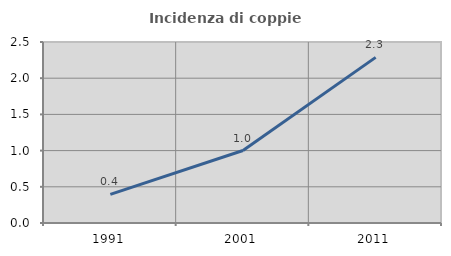
| Category | Incidenza di coppie miste |
|---|---|
| 1991.0 | 0.395 |
| 2001.0 | 1.001 |
| 2011.0 | 2.288 |